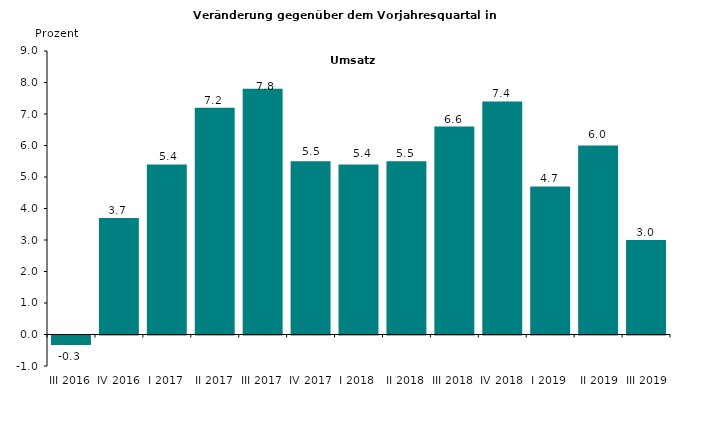
| Category | Series 0 |
|---|---|
| III 2016 | -0.3 |
| IV 2016 | 3.7 |
| I 2017 | 5.4 |
| II 2017 | 7.2 |
| III 2017 | 7.8 |
| IV 2017 | 5.5 |
| I 2018 | 5.4 |
| II 2018 | 5.5 |
| III 2018 | 6.6 |
| IV 2018 | 7.4 |
| I 2019 | 4.7 |
|  II 2019 | 6 |
|  III 2019 | 3 |